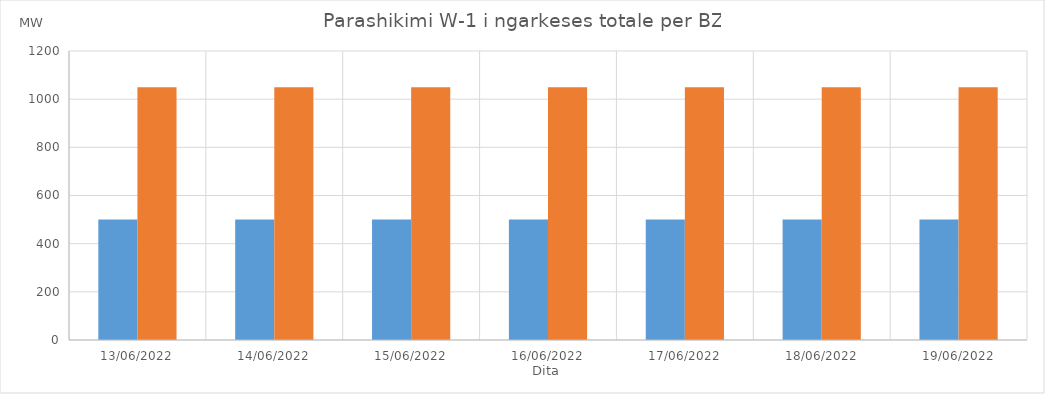
| Category | Min (MW) | Max (MW) |
|---|---|---|
| 13/06/2022 | 500 | 1050 |
| 14/06/2022 | 500 | 1050 |
| 15/06/2022 | 500 | 1050 |
| 16/06/2022 | 500 | 1050 |
| 17/06/2022 | 500 | 1050 |
| 18/06/2022 | 500 | 1050 |
| 19/06/2022 | 500 | 1050 |